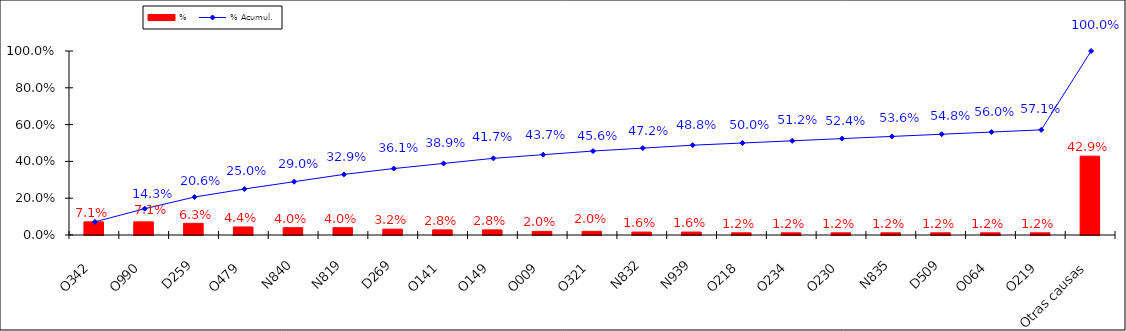
| Category | % |
|---|---|
| O342 | 0.071 |
| O990 | 0.071 |
| D259 | 0.063 |
| O479 | 0.044 |
| N840 | 0.04 |
| N819 | 0.04 |
| D269 | 0.032 |
| O141 | 0.028 |
| O149 | 0.028 |
| O009 | 0.02 |
| O321 | 0.02 |
| N832 | 0.016 |
| N939 | 0.016 |
| O218 | 0.012 |
| O234 | 0.012 |
| O230 | 0.012 |
| N835 | 0.012 |
| D509 | 0.012 |
| O064 | 0.012 |
| O219 | 0.012 |
| Otras causas | 0.429 |